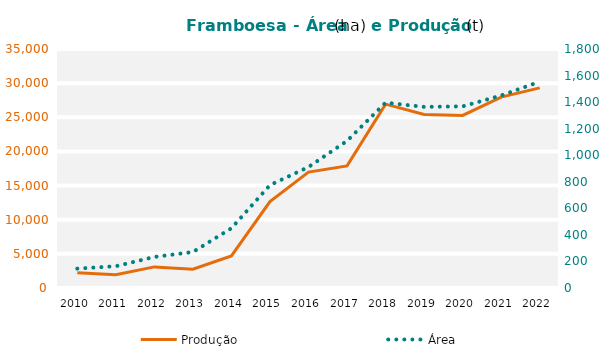
| Category | Produção  |
|---|---|
| 2010 | 2216 |
| 2011 | 1943 |
| 2012 | 3091 |
| 2013 | 2757 |
| 2014 | 4697 |
| 2015 | 12659 |
| 2016 | 16972 |
| 2017 | 17880 |
| 2018 | 26926 |
| 2019 | 25420 |
| 2020 | 25276 |
| 2021 | 27950 |
| 2022 | 29304 |